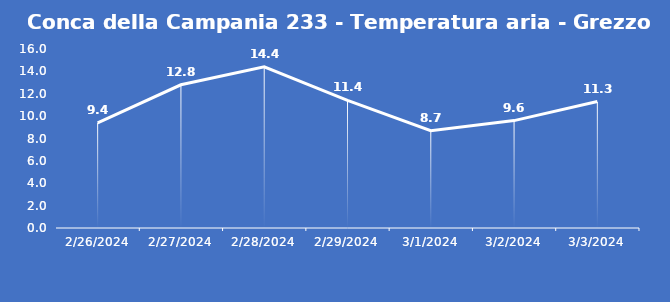
| Category | Conca della Campania 233 - Temperatura aria - Grezzo (°C) |
|---|---|
| 2/26/24 | 9.4 |
| 2/27/24 | 12.8 |
| 2/28/24 | 14.4 |
| 2/29/24 | 11.4 |
| 3/1/24 | 8.7 |
| 3/2/24 | 9.6 |
| 3/3/24 | 11.3 |